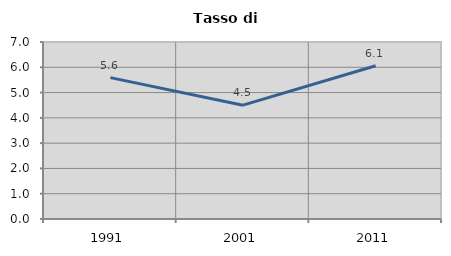
| Category | Tasso di disoccupazione   |
|---|---|
| 1991.0 | 5.59 |
| 2001.0 | 4.502 |
| 2011.0 | 6.061 |